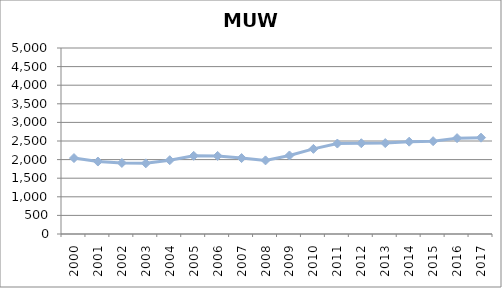
| Category | Series 0 |
|---|---|
| 2000.0 | 2041.192 |
| 2001.0 | 1948.058 |
| 2002.0 | 1910.617 |
| 2003.0 | 1899.375 |
| 2004.0 | 1983.758 |
| 2005.0 | 2101.475 |
| 2006.0 | 2099.225 |
| 2007.0 | 2041.258 |
| 2008.0 | 1979.158 |
| 2009.0 | 2110.675 |
| 2010.0 | 2288.342 |
| 2011.0 | 2431.633 |
| 2012.0 | 2439.55 |
| 2013.0 | 2443.925 |
| 2014.0 | 2481.858 |
| 2015.0 | 2495.25 |
| 2016.0 | 2577.025 |
| 2017.0 | 2589.467 |